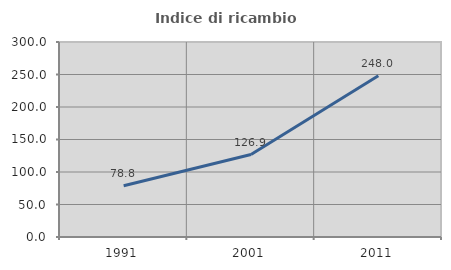
| Category | Indice di ricambio occupazionale  |
|---|---|
| 1991.0 | 78.793 |
| 2001.0 | 126.923 |
| 2011.0 | 248 |